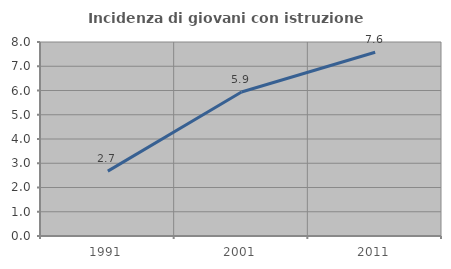
| Category | Incidenza di giovani con istruzione universitaria |
|---|---|
| 1991.0 | 2.674 |
| 2001.0 | 5.936 |
| 2011.0 | 7.576 |